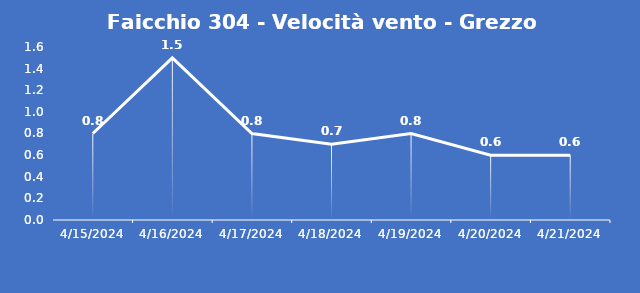
| Category | Faicchio 304 - Velocità vento - Grezzo (m/s) |
|---|---|
| 4/15/24 | 0.8 |
| 4/16/24 | 1.5 |
| 4/17/24 | 0.8 |
| 4/18/24 | 0.7 |
| 4/19/24 | 0.8 |
| 4/20/24 | 0.6 |
| 4/21/24 | 0.6 |